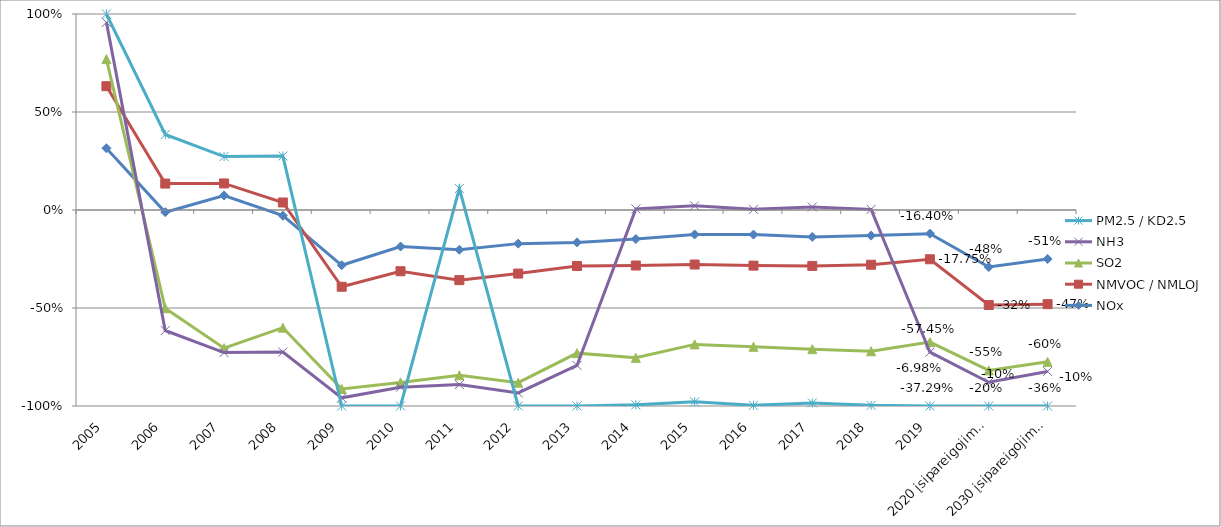
| Category | NOx | NMVOC / NMLOJ | SO2 | NH3 | PM2.5 / KD2.5 |
|---|---|---|---|---|---|
| 2005 | 62.8 | 63.1 | 27.5 | 37.4 | 8.5 |
| 2006 | -0.002 | 0.019 | -0.069 | -0.016 | 0.035 |
| 2007 | 0.019 | 0.016 | -0.182 | -0.006 | 0.035 |
| 2008 | -0.014 | 0.019 | -0.284 | -0.062 | 0.118 |
| 2009 | -0.159 | -0.062 | -0.295 | -0.025 | -0.024 |
| 2010 | -0.115 | -0.078 | -0.349 | -0.015 | -0.059 |
| 2011 | -0.131 | -0.1 | -0.313 | -0.03 | 0.071 |
| 2012 | -0.121 | -0.108 | -0.393 | -0.037 | -0.047 |
| 2013 | -0.178 | -0.13 | -0.48 | -0.067 | -0.224 |
| 2014 | -0.167 | -0.152 | -0.531 | 0.007 | -0.271 |
| 2015 | -0.14 | -0.173 | -0.458 | 0.024 | -0.329 |
| 2016 | -0.143 | -0.181 | -0.473 | 0.004 | -0.341 |
| 2017 | -0.17 | -0.184 | -0.527 | 0.019 | -0.341 |
| 2018 | -0.156 | -0.177 | -0.527 | 0.004 | -0.329 |
| 2019 | -0.164 | -0.177 | -0.575 | -0.07 | -0.373 |
| 2020 įsipareigojimai | -0.48 | -0.32 | -0.55 | -0.1 | -0.2 |
| 2030 įsipareigojimai | -0.51 | -0.47 | -0.6 | -0.1 | -0.36 |